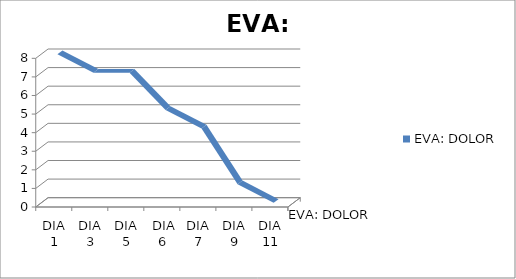
| Category | EVA: DOLOR |
|---|---|
| DIA 1 | 8 |
| DIA 3 | 7 |
| DIA 5 | 7 |
|  DIA 6 | 5 |
| DIA 7 | 4 |
| DIA 9 | 1 |
| DIA 11 | 0 |